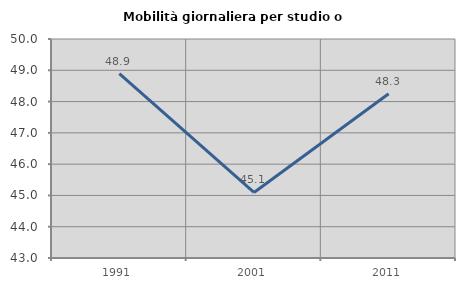
| Category | Mobilità giornaliera per studio o lavoro |
|---|---|
| 1991.0 | 48.89 |
| 2001.0 | 45.095 |
| 2011.0 | 48.251 |